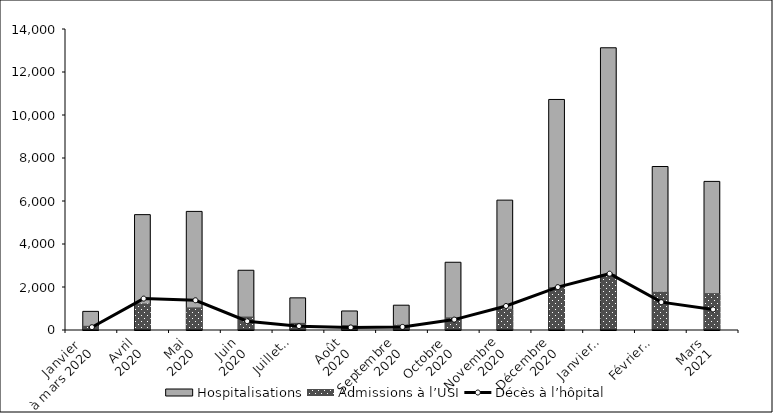
| Category | Hospitalisations | Admissions à l’USI |
|---|---|---|
| Janvier 
à mars 2020 | 867 | 196 |
| Avril
2020 | 5366 | 1233 |
| Mai
2020 | 5516 | 1051 |
| Juin
2020 | 2779 | 626 |
| Juillet
2020 | 1495 | 332 |
| Août
2020 | 885 | 229 |
| Septembre
2020 | 1154 | 245 |
| Octobre
2020 | 3151 | 588 |
| Novembre
2020 | 6040 | 988 |
| Décembre
2020 | 10723 | 1995 |
| Janvier
2021 | 13127 | 2601 |
| Février
2021 | 7604 | 1775 |
| Mars
2021 | 6912 | 1716 |